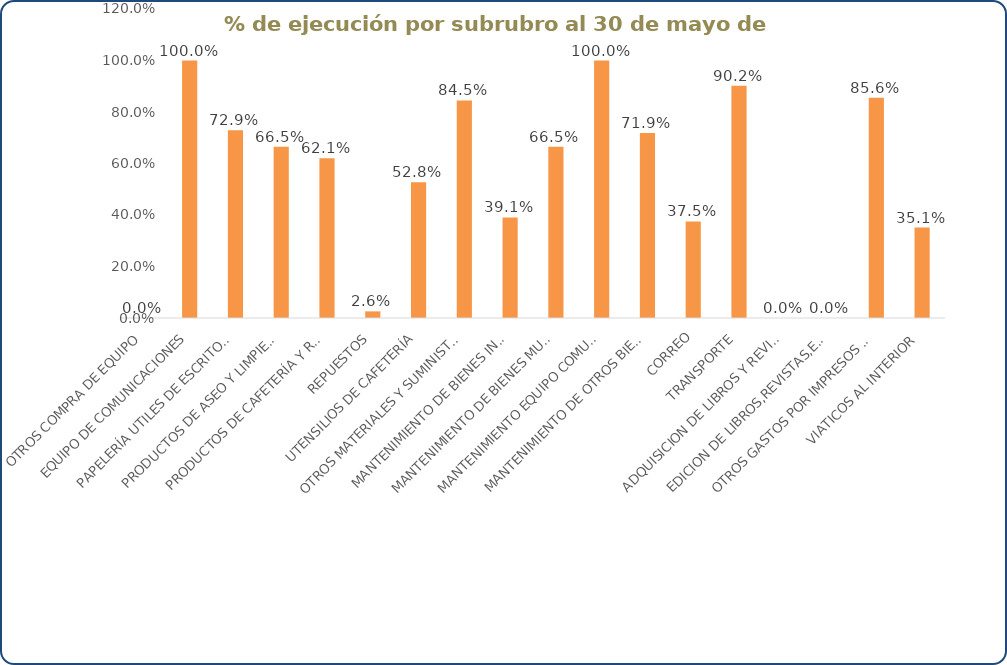
| Category | % de ejecución por subrubro al 30 de mayo de 2016 |
|---|---|
| OTROS COMPRA DE EQUIPO | 0 |
| EQUIPO DE COMUNICACIONES | 1 |
| PAPELERÍA UTILES DE ESCRITORIO Y OFICINA  | 0.729 |
| PRODUCTOS DE ASEO Y LIMPIEZA | 0.665 |
| PRODUCTOS DE CAFETERÍA Y RESTAURANTE | 0.621 |
| REPUESTOS | 0.026 |
| UTENSILIOS DE CAFETERÍA | 0.528 |
| OTROS MATERIALES Y SUMINISTROS  | 0.845 |
| MANTENIMIENTO DE BIENES INMUEBLES | 0.391 |
| MANTENIMIENTO DE BIENES MUEBLES, EQUIPOS Y ENSERES | 0.665 |
| MANTENIMIENTO EQUIPO COMUNICACIÓN Y COMPUTACION | 1 |
| MANTENIMIENTO DE OTROS BIENES | 0.719 |
| CORREO | 0.375 |
| TRANSPORTE | 0.902 |
| ADQUISICION DE LIBROS Y REVISTAS | 0 |
| EDICION DE LIBROS,REVISTAS,ESCRITOS Y TRABAJOS TIPOGRAFICOS | 0 |
| OTROS GASTOS POR IMPRESOS Y PUBLICACIONES  | 0.856 |
| VIATICOS AL INTERIOR | 0.351 |